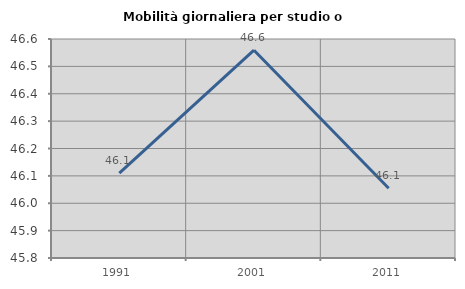
| Category | Mobilità giornaliera per studio o lavoro |
|---|---|
| 1991.0 | 46.11 |
| 2001.0 | 46.559 |
| 2011.0 | 46.055 |